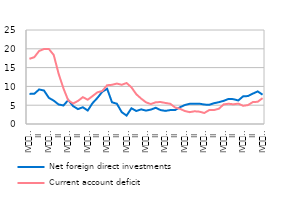
| Category | Net foreign direct investments | Current account deficit |
|---|---|---|
| IV
2007 | 8.007 | 17.335 |
| I | 8.035 | 17.769 |
| II | 9.188 | 19.419 |
| III | 8.903 | 19.947 |
| IV
2008 | 6.956 | 19.941 |
| I | 6.216 | 18.368 |
| II | 5.196 | 13.408 |
| III | 4.928 | 9.485 |
| IV
2009 | 6.365 | 6.254 |
| I | 4.743 | 5.448 |
| II | 3.966 | 6.144 |
| III | 4.456 | 7.133 |
| IV
2010 | 3.594 | 6.459 |
| I | 5.552 | 7.436 |
| II | 6.945 | 8.428 |
| III | 8.579 | 8.779 |
| IV
2011 | 9.364 | 10.313 |
| I | 5.774 | 10.421 |
| II | 5.392 | 10.762 |
| III | 3.153 | 10.432 |
| IV
2012 | 2.235 | 10.901 |
| I | 4.183 | 9.751 |
| II | 3.46 | 7.918 |
| III | 3.898 | 6.762 |
| IV
2013 | 3.564 | 5.761 |
| I | 3.83 | 5.308 |
| II | 4.313 | 5.776 |
| III | 3.703 | 5.85 |
| IV
2014 | 3.486 | 5.596 |
| I | 3.704 | 5.376 |
| II | 3.721 | 4.387 |
| III | 4.454 | 4.038 |
| IV
2015 | 5.05 | 3.454 |
| I | 5.369 | 3.149 |
| II | 5.378 | 3.384 |
| III | 5.404 | 3.279 |
| IV
2016 | 5.172 | 2.927 |
| I | 5.099 | 3.692 |
| II | 5.529 | 3.715 |
| III | 5.8 | 4.058 |
| IV
2017 | 6.166 | 5.23 |
| I | 6.674 | 5.381 |
| II | 6.605 | 5.239 |
| III | 6.254 | 5.42 |
| IV
2018 | 7.365 | 4.844 |
| I | 7.43 | 5.035 |
| II | 8.081 | 5.838 |
| III | 8.67 | 5.902 |
| IV
2019 | 7.804 | 6.882 |